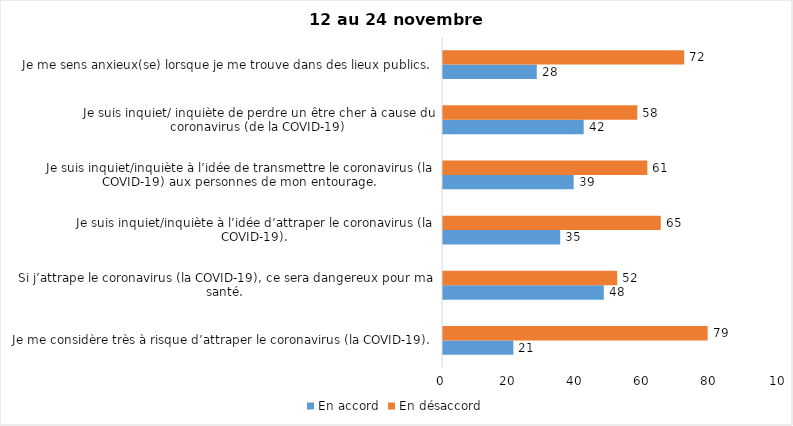
| Category | En accord | En désaccord |
|---|---|---|
| Je me considère très à risque d’attraper le coronavirus (la COVID-19). | 21 | 79 |
| Si j’attrape le coronavirus (la COVID-19), ce sera dangereux pour ma santé. | 48 | 52 |
| Je suis inquiet/inquiète à l’idée d’attraper le coronavirus (la COVID-19). | 35 | 65 |
| Je suis inquiet/inquiète à l’idée de transmettre le coronavirus (la COVID-19) aux personnes de mon entourage. | 39 | 61 |
| Je suis inquiet/ inquiète de perdre un être cher à cause du coronavirus (de la COVID-19) | 42 | 58 |
| Je me sens anxieux(se) lorsque je me trouve dans des lieux publics. | 28 | 72 |